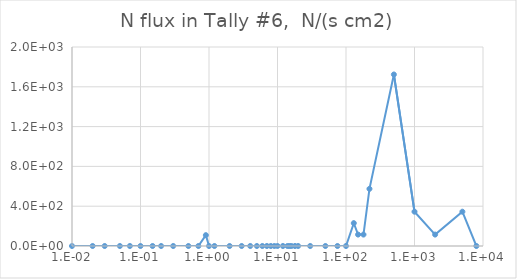
| Category | Series 0 |
|---|---|
| 1e-09 | 0 |
| 1e-08 | 0 |
| 2.5e-08 | 0 |
| 1e-07 | 0 |
| 2e-07 | 0 |
| 5e-07 | 0 |
| 1e-06 | 0 |
| 2e-06 | 0 |
| 5e-06 | 0 |
| 1e-05 | 0 |
| 2e-05 | 0 |
| 5e-05 | 0 |
| 0.0001 | 0 |
| 0.0002 | 0 |
| 0.0005 | 0 |
| 0.001 | 0 |
| 0.002 | 0 |
| 0.005 | 0 |
| 0.01 | 0 |
| 0.02 | 0 |
| 0.03 | 0 |
| 0.05 | 0 |
| 0.07 | 0 |
| 0.1 | 0 |
| 0.15 | 0 |
| 0.2 | 0 |
| 0.3 | 0 |
| 0.5 | 0 |
| 0.7 | 0 |
| 0.9 | 108.942 |
| 1.0 | 0 |
| 1.2 | 0 |
| 2.0 | 0 |
| 3.0 | 0 |
| 4.0 | 0 |
| 5.0 | 0 |
| 6.0 | 0 |
| 7.0 | 0 |
| 8.0 | 0 |
| 9.0 | 0 |
| 10.0 | 0 |
| 12.0 | 0 |
| 14.0 | 0 |
| 15.0 | 0 |
| 16.0 | 0 |
| 18.0 | 0 |
| 20.0 | 0 |
| 30.0 | 0 |
| 50.0 | 0 |
| 75.0 | 0 |
| 100.0 | 0 |
| 130.0 | 229.828 |
| 150.0 | 114.914 |
| 180.0 | 114.914 |
| 220.0 | 574.57 |
| 500.0 | 1723.71 |
| 1000.0 | 344.743 |
| 2000.0 | 114.914 |
| 5000.0 | 344.742 |
| 8000.0 | 0 |